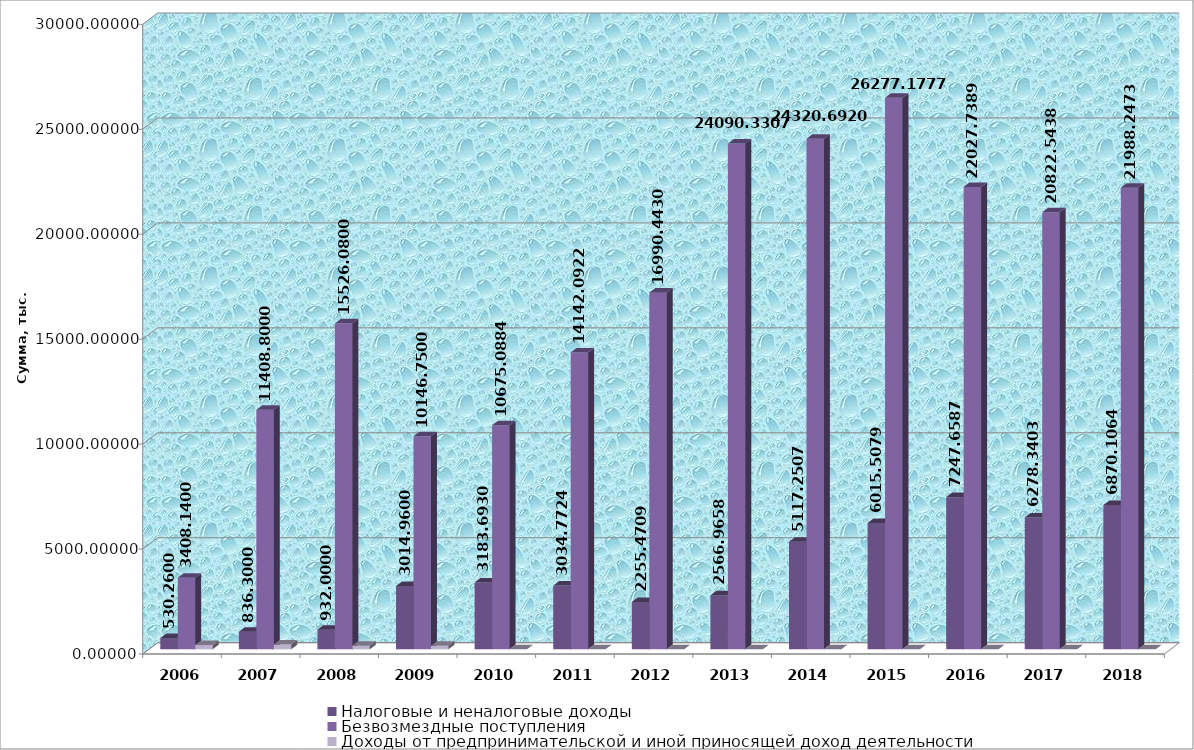
| Category | Налоговые и неналоговые доходы | Безвозмездные поступления | Доходы от предпринимательской и иной приносящей доход деятельности |
|---|---|---|---|
| 2006.0 | 530.26 | 3408.14 | 203.1 |
| 2007.0 | 836.3 | 11408.8 | 225.7 |
| 2008.0 | 932 | 15526.08 | 171 |
| 2009.0 | 3014.96 | 10146.75 | 164.99 |
| 2010.0 | 3183.693 | 10675.088 | 0 |
| 2011.0 | 3034.772 | 14142.092 | 0 |
| 2012.0 | 2255.471 | 16990.443 | 0 |
| 2013.0 | 2566.966 | 24090.331 | 0 |
| 2014.0 | 5117.251 | 24320.692 | 0 |
| 2015.0 | 6015.508 | 26277.178 | 0 |
| 2016.0 | 7247.659 | 22027.739 | 0 |
| 2017.0 | 6278.34 | 20822.544 | 0 |
| 2018.0 | 6870.106 | 21988.247 | 0 |